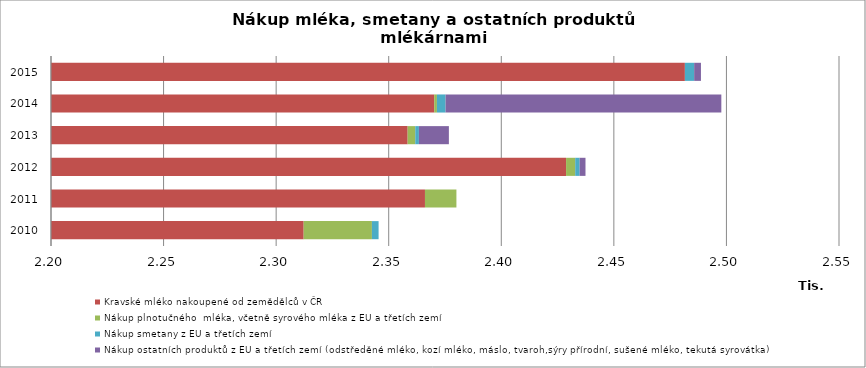
| Category | Kravské mléko nakoupené od zemědělců v ČR | Nákup plnotučného  mléka, včetně syrového mléka z EU a třetích zemí | Nákup smetany z EU a třetích zemí | Nákup ostatních produktů z EU a třetích zemí (odstředěné mléko, kozí mléko, máslo, tvaroh,sýry přírodní, sušené mléko, tekutá syrovátka)   |
|---|---|---|---|---|
| 2010.0 | 2312.226 | 30.314 | 2.962 | 0 |
| 2011.0 | 2366.104 | 13.967 | 0 | 0 |
| 2012.0 | 2428.774 | 4.057 | 1.988 | 2.58 |
| 2013.0 | 2358.416 | 3.377 | 1.621 | 13.31 |
| 2014.0 | 2370.204 | 1.211 | 3.843 | 122.48 |
| 2015.0 | 2481.55 | 0 | 4.115 | 3.022 |